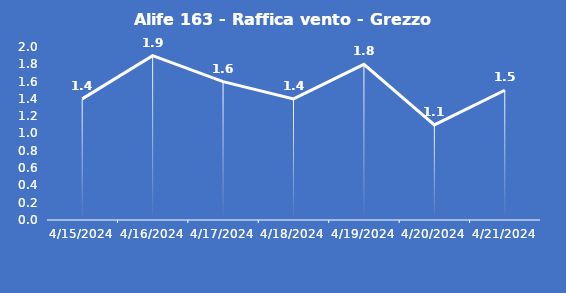
| Category | Alife 163 - Raffica vento - Grezzo (m/s) |
|---|---|
| 4/15/24 | 1.4 |
| 4/16/24 | 1.9 |
| 4/17/24 | 1.6 |
| 4/18/24 | 1.4 |
| 4/19/24 | 1.8 |
| 4/20/24 | 1.1 |
| 4/21/24 | 1.5 |